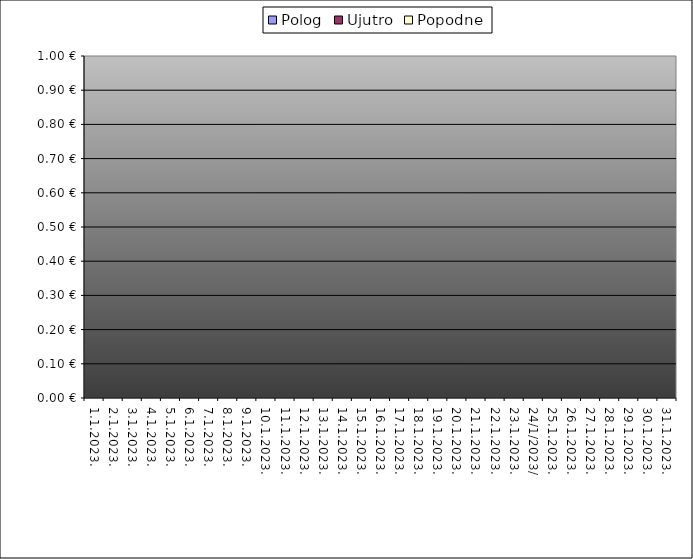
| Category | Polog | Ujutro | Popodne |
|---|---|---|---|
| 1.1.2023. |  | 0 | 0 |
| 2.1.2023. |  | 0 | 0 |
| 3.1.2023. |  | 0 | 0 |
| 4.1.2023. |  | 0 | 0 |
| 5.1.2023. |  | 0 | 0 |
| 6.1.2023. |  | 0 | 0 |
| 7.1.2023. |  | 0 | 0 |
| 8.1.2023. |  | 0 | 0 |
| 9.1.2023. |  | 0 | 0 |
| 10.1.2023. |  | 0 | 0 |
| 11.1.2023. |  | 0 | 0 |
| 12.1.2023. |  | 0 | 0 |
| 13.1.2023. |  | 0 | 0 |
| 14.1.2023. |  | 0 | 0 |
| 15.1.2023. |  | 0 | 0 |
| 16.1.2023. |  | 0 | 0 |
| 17.1.2023. |  | 0 | 0 |
| 18.1.2023. |  | 0 | 0 |
| 19.1.2023. |  | 0 | 0 |
| 20.1.2023. |  | 0 | 0 |
| 21.1.2023. |  | 0 | 0 |
| 22.1.2023. |  | 0 | 0 |
| 23.1.2023. |  | 0 | 0 |
| 24.1.2023. |  | 0 | 0 |
| 25.1.2023. |  | 0 | 0 |
| 26.1.2023. |  | 0 | 0 |
| 27.1.2023. |  | 0 | 0 |
| 28.1.2023. |  | 0 | 0 |
| 29.1.2023. |  | 0 | 0 |
| 30.1.2023. |  | 0 | 0 |
| 31.1.2023. |  | 0 | 0 |